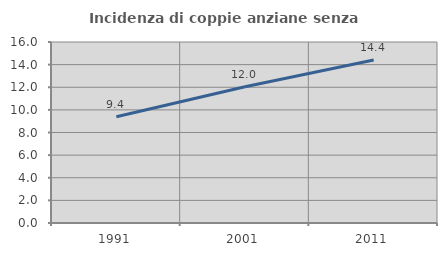
| Category | Incidenza di coppie anziane senza figli  |
|---|---|
| 1991.0 | 9.393 |
| 2001.0 | 12.047 |
| 2011.0 | 14.407 |